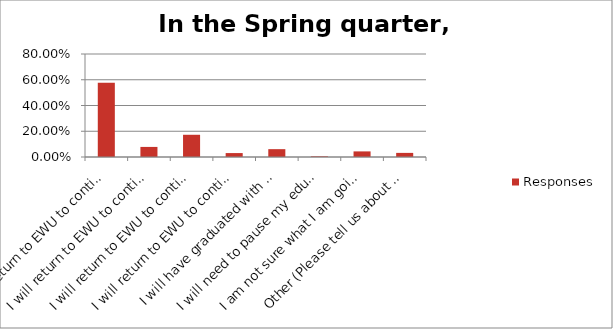
| Category | Responses |
|---|---|
| I will return to EWU to continue my education, regardless whether my classes are online or in-person. | 0.577 |
| I will return to EWU to continue my education, but only if my classes offer the flexibility to move between in-person and online participation based on my needs. | 0.078 |
| I will return to EWU to continue my education, but only if my classes are online. | 0.173 |
| I will return to EWU to continue my education, but only if my classes are in-person. | 0.03 |
| I will have graduated with my degree and take the next big step in my life! (Congratulations!) | 0.061 |
| I will need to pause my education. | 0.005 |
| I am not sure what I am going to do. | 0.044 |
| Other (Please tell us about your plans) | 0.032 |